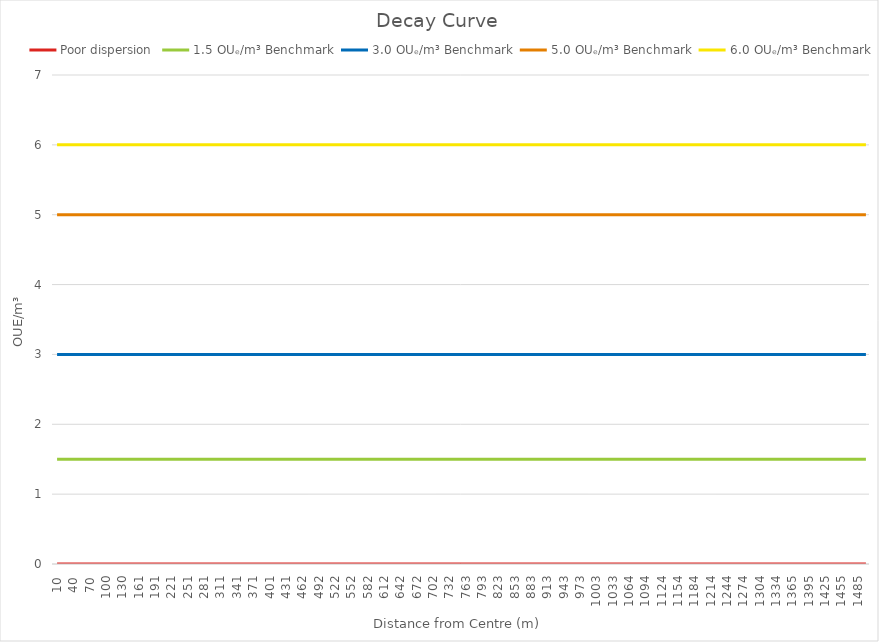
| Category | Poor dispersion | 1.5 OUₑ/m³ Benchmark | 3.0 OUₑ/m³ Benchmark | 5.0 OUₑ/m³ Benchmark | 6.0 OUₑ/m³ Benchmark |
|---|---|---|---|---|---|
| 10.0 | 0 | 1.5 | 3 | 5 | 6 |
| 25.05 | 0 | 1.5 | 3 | 5 | 6 |
| 40.1 | 0 | 1.5 | 3 | 5 | 6 |
| 55.15 | 0 | 1.5 | 3 | 5 | 6 |
| 70.2 | 0 | 1.5 | 3 | 5 | 6 |
| 85.25 | 0 | 1.5 | 3 | 5 | 6 |
| 100.3 | 0 | 1.5 | 3 | 5 | 6 |
| 115.35 | 0 | 1.5 | 3 | 5 | 6 |
| 130.4 | 0 | 1.5 | 3 | 5 | 6 |
| 145.45 | 0 | 1.5 | 3 | 5 | 6 |
| 160.51 | 0 | 1.5 | 3 | 5 | 6 |
| 175.56 | 0 | 1.5 | 3 | 5 | 6 |
| 190.61 | 0 | 1.5 | 3 | 5 | 6 |
| 205.66 | 0 | 1.5 | 3 | 5 | 6 |
| 220.71 | 0 | 1.5 | 3 | 5 | 6 |
| 235.76 | 0 | 1.5 | 3 | 5 | 6 |
| 250.81 | 0 | 1.5 | 3 | 5 | 6 |
| 265.86 | 0 | 1.5 | 3 | 5 | 6 |
| 280.91 | 0 | 1.5 | 3 | 5 | 6 |
| 295.96 | 0 | 1.5 | 3 | 5 | 6 |
| 311.01 | 0 | 1.5 | 3 | 5 | 6 |
| 326.06 | 0 | 1.5 | 3 | 5 | 6 |
| 341.11 | 0 | 1.5 | 3 | 5 | 6 |
| 356.16 | 0 | 1.5 | 3 | 5 | 6 |
| 371.21 | 0 | 1.5 | 3 | 5 | 6 |
| 386.26 | 0 | 1.5 | 3 | 5 | 6 |
| 401.31 | 0 | 1.5 | 3 | 5 | 6 |
| 416.36 | 0 | 1.5 | 3 | 5 | 6 |
| 431.41 | 0 | 1.5 | 3 | 5 | 6 |
| 446.46 | 0 | 1.5 | 3 | 5 | 6 |
| 461.52 | 0 | 1.5 | 3 | 5 | 6 |
| 476.57 | 0 | 1.5 | 3 | 5 | 6 |
| 491.62 | 0 | 1.5 | 3 | 5 | 6 |
| 506.67 | 0 | 1.5 | 3 | 5 | 6 |
| 521.72 | 0 | 1.5 | 3 | 5 | 6 |
| 536.77 | 0 | 1.5 | 3 | 5 | 6 |
| 551.82 | 0 | 1.5 | 3 | 5 | 6 |
| 566.87 | 0 | 1.5 | 3 | 5 | 6 |
| 581.92 | 0 | 1.5 | 3 | 5 | 6 |
| 596.97 | 0 | 1.5 | 3 | 5 | 6 |
| 612.02 | 0 | 1.5 | 3 | 5 | 6 |
| 627.07 | 0 | 1.5 | 3 | 5 | 6 |
| 642.12 | 0 | 1.5 | 3 | 5 | 6 |
| 657.17 | 0 | 1.5 | 3 | 5 | 6 |
| 672.22 | 0 | 1.5 | 3 | 5 | 6 |
| 687.27 | 0 | 1.5 | 3 | 5 | 6 |
| 702.32 | 0 | 1.5 | 3 | 5 | 6 |
| 717.37 | 0 | 1.5 | 3 | 5 | 6 |
| 732.42 | 0 | 1.5 | 3 | 5 | 6 |
| 747.47 | 0 | 1.5 | 3 | 5 | 6 |
| 762.53 | 0 | 1.5 | 3 | 5 | 6 |
| 777.58 | 0 | 1.5 | 3 | 5 | 6 |
| 792.63 | 0 | 1.5 | 3 | 5 | 6 |
| 807.68 | 0 | 1.5 | 3 | 5 | 6 |
| 822.73 | 0 | 1.5 | 3 | 5 | 6 |
| 837.78 | 0 | 1.5 | 3 | 5 | 6 |
| 852.83 | 0 | 1.5 | 3 | 5 | 6 |
| 867.88 | 0 | 1.5 | 3 | 5 | 6 |
| 882.93 | 0 | 1.5 | 3 | 5 | 6 |
| 897.98 | 0 | 1.5 | 3 | 5 | 6 |
| 913.03 | 0 | 1.5 | 3 | 5 | 6 |
| 928.08 | 0 | 1.5 | 3 | 5 | 6 |
| 943.13 | 0 | 1.5 | 3 | 5 | 6 |
| 958.18 | 0 | 1.5 | 3 | 5 | 6 |
| 973.23 | 0 | 1.5 | 3 | 5 | 6 |
| 988.28 | 0 | 1.5 | 3 | 5 | 6 |
| 1003.33 | 0 | 1.5 | 3 | 5 | 6 |
| 1018.38 | 0 | 1.5 | 3 | 5 | 6 |
| 1033.43 | 0 | 1.5 | 3 | 5 | 6 |
| 1048.48 | 0 | 1.5 | 3 | 5 | 6 |
| 1063.54 | 0 | 1.5 | 3 | 5 | 6 |
| 1078.59 | 0 | 1.5 | 3 | 5 | 6 |
| 1093.64 | 0 | 1.5 | 3 | 5 | 6 |
| 1108.69 | 0 | 1.5 | 3 | 5 | 6 |
| 1123.74 | 0 | 1.5 | 3 | 5 | 6 |
| 1138.79 | 0 | 1.5 | 3 | 5 | 6 |
| 1153.84 | 0 | 1.5 | 3 | 5 | 6 |
| 1168.89 | 0 | 1.5 | 3 | 5 | 6 |
| 1183.94 | 0 | 1.5 | 3 | 5 | 6 |
| 1198.99 | 0 | 1.5 | 3 | 5 | 6 |
| 1214.04 | 0 | 1.5 | 3 | 5 | 6 |
| 1229.09 | 0 | 1.5 | 3 | 5 | 6 |
| 1244.14 | 0 | 1.5 | 3 | 5 | 6 |
| 1259.19 | 0 | 1.5 | 3 | 5 | 6 |
| 1274.24 | 0 | 1.5 | 3 | 5 | 6 |
| 1289.29 | 0 | 1.5 | 3 | 5 | 6 |
| 1304.34 | 0 | 1.5 | 3 | 5 | 6 |
| 1319.39 | 0 | 1.5 | 3 | 5 | 6 |
| 1334.44 | 0 | 1.5 | 3 | 5 | 6 |
| 1349.49 | 0 | 1.5 | 3 | 5 | 6 |
| 1364.55 | 0 | 1.5 | 3 | 5 | 6 |
| 1379.6 | 0 | 1.5 | 3 | 5 | 6 |
| 1394.65 | 0 | 1.5 | 3 | 5 | 6 |
| 1409.7 | 0 | 1.5 | 3 | 5 | 6 |
| 1424.75 | 0 | 1.5 | 3 | 5 | 6 |
| 1439.8 | 0 | 1.5 | 3 | 5 | 6 |
| 1454.85 | 0 | 1.5 | 3 | 5 | 6 |
| 1469.9 | 0 | 1.5 | 3 | 5 | 6 |
| 1484.95 | 0 | 1.5 | 3 | 5 | 6 |
| 1500.0 | 0 | 1.5 | 3 | 5 | 6 |